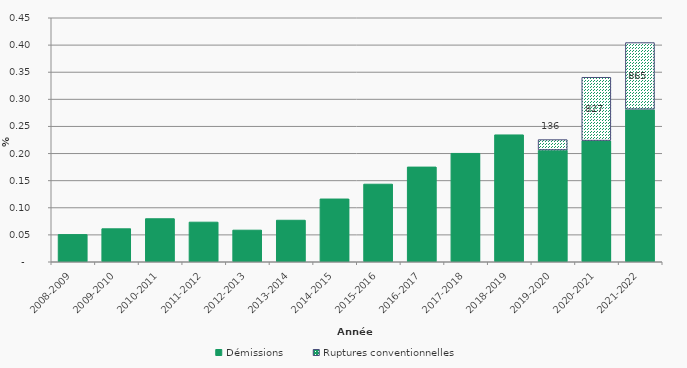
| Category | Démissions | Ruptures conventionnelles |
|---|---|---|
| 2008-2009 | 0.051 | 0 |
| 2009-2010 | 0.061 | 0 |
| 2010-2011 | 0.08 | 0 |
| 2011-2012 | 0.073 | 0 |
| 2012-2013 | 0.059 | 0 |
| 2013-2014 | 0.077 | 0 |
| 2014-2015 | 0.116 | 0 |
| 2015-2016 | 0.143 | 0 |
| 2016-2017 | 0.175 | 0 |
| 2017-2018 | 0.2 | 0 |
| 2018-2019 | 0.234 | 0 |
| 2019-2020 | 0.206 | 0.019 |
| 2020-2021 | 0.223 | 0.117 |
| 2021-2022 | 0.281 | 0.123 |